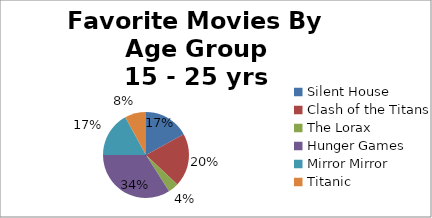
| Category | 15 - 25 yrs |
|---|---|
| Silent House | 0.17 |
| Clash of the Titans | 0.2 |
| The Lorax | 0.04 |
| Hunger Games | 0.34 |
| Mirror Mirror | 0.17 |
| Titanic | 0.08 |